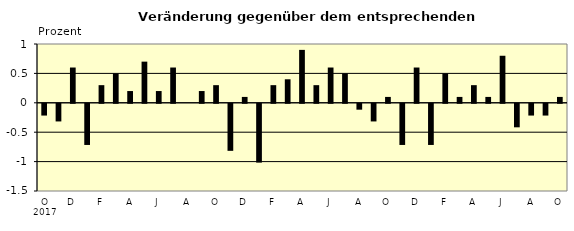
| Category | Series 0 |
|---|---|
| 0 | -0.2 |
| 1 | -0.3 |
| 2 | 0.6 |
| 3 | -0.7 |
| 4 | 0.3 |
| 5 | 0.5 |
| 6 | 0.2 |
| 7 | 0.7 |
| 8 | 0.2 |
| 9 | 0.6 |
| 10 | 0 |
| 11 | 0.2 |
| 12 | 0.3 |
| 13 | -0.8 |
| 14 | 0.1 |
| 15 | -1 |
| 16 | 0.3 |
| 17 | 0.4 |
| 18 | 0.9 |
| 19 | 0.3 |
| 20 | 0.6 |
| 21 | 0.5 |
| 22 | -0.1 |
| 23 | -0.3 |
| 24 | 0.1 |
| 25 | -0.7 |
| 26 | 0.6 |
| 27 | -0.7 |
| 28 | 0.5 |
| 29 | 0.1 |
| 30 | 0.3 |
| 31 | 0.1 |
| 32 | 0.8 |
| 33 | -0.4 |
| 34 | -0.2 |
| 35 | -0.2 |
| 36 | 0.1 |